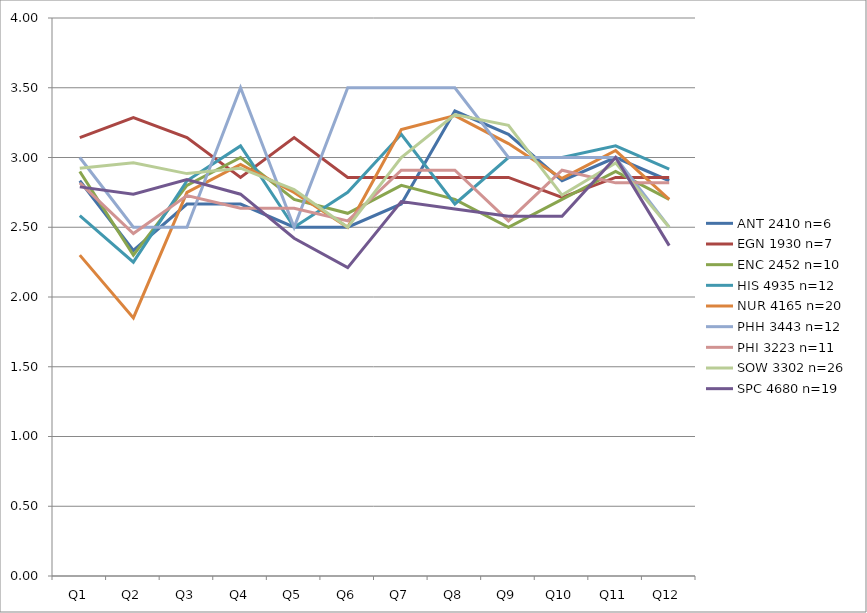
| Category | ANT 2410 n=6 | EGN 1930 n=7 | ENC 2452 n=10 | HIS 4935 n=12 | NUR 4165 n=20 | PHH 3443 n=12 | PHI 3223 n=11 | SOW 3302 n=26 | SPC 4680 n=19 |
|---|---|---|---|---|---|---|---|---|---|
| Q1 | 2.833 | 3.143 | 2.9 | 2.583 | 2.3 | 3 | 2.818 | 2.923 | 2.789 |
| Q2 | 2.333 | 3.286 | 2.3 | 2.25 | 1.85 | 2.5 | 2.455 | 2.962 | 2.737 |
| Q3 | 2.667 | 3.143 | 2.8 | 2.833 | 2.75 | 2.5 | 2.727 | 2.885 | 2.842 |
| Q4 | 2.667 | 2.857 | 3 | 3.083 | 2.95 | 3.5 | 2.636 | 2.923 | 2.737 |
| Q5 | 2.5 | 3.143 | 2.7 | 2.5 | 2.75 | 2.5 | 2.636 | 2.769 | 2.421 |
| Q6 | 2.5 | 2.857 | 2.6 | 2.75 | 2.5 | 3.5 | 2.545 | 2.5 | 2.211 |
| Q7 | 2.667 | 2.857 | 2.8 | 3.167 | 3.2 | 3.5 | 2.909 | 3 | 2.684 |
| Q8 | 3.333 | 2.857 | 2.7 | 2.667 | 3.3 | 3.5 | 2.909 | 3.308 | 2.632 |
| Q9 | 3.167 | 2.857 | 2.5 | 3 | 3.1 | 3 | 2.545 | 3.231 | 2.579 |
| Q10 | 2.833 | 2.714 | 2.7 | 3 | 2.85 | 3 | 2.909 | 2.731 | 2.579 |
| Q11 | 3 | 2.857 | 2.9 | 3.083 | 3.05 | 3 | 2.818 | 2.962 | 3 |
| Q12 | 2.833 | 2.857 | 2.7 | 2.917 | 2.7 | 2.5 | 2.818 | 2.5 | 2.368 |